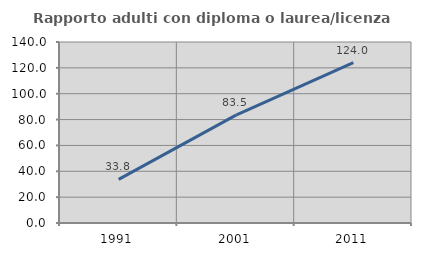
| Category | Rapporto adulti con diploma o laurea/licenza media  |
|---|---|
| 1991.0 | 33.75 |
| 2001.0 | 83.486 |
| 2011.0 | 123.958 |